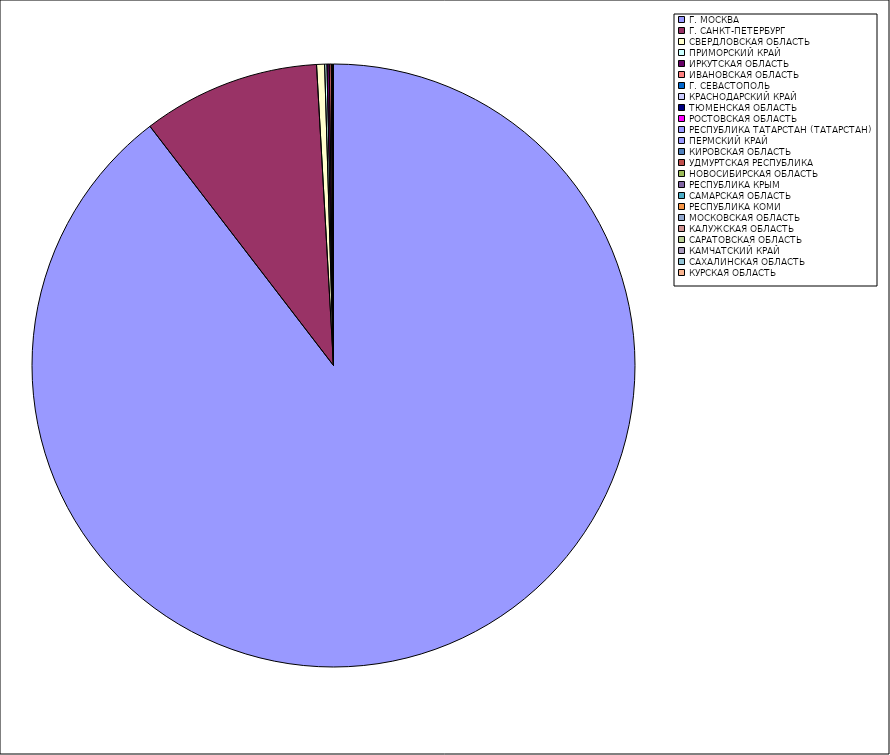
| Category | Оборот |
|---|---|
| Г. МОСКВА | 89.571 |
| Г. САНКТ-ПЕТЕРБУРГ | 9.519 |
| СВЕРДЛОВСКАЯ ОБЛАСТЬ | 0.428 |
| ПРИМОРСКИЙ КРАЙ | 0.123 |
| ИРКУТСКАЯ ОБЛАСТЬ | 0.122 |
| ИВАНОВСКАЯ ОБЛАСТЬ | 0.104 |
| Г. СЕВАСТОПОЛЬ | 0.025 |
| КРАСНОДАРСКИЙ КРАЙ | 0.02 |
| ТЮМЕНСКАЯ ОБЛАСТЬ | 0.011 |
| РОСТОВСКАЯ ОБЛАСТЬ | 0.009 |
| РЕСПУБЛИКА ТАТАРСТАН (ТАТАРСТАН) | 0.008 |
| ПЕРМСКИЙ КРАЙ | 0.006 |
| КИРОВСКАЯ ОБЛАСТЬ | 0.005 |
| УДМУРТСКАЯ РЕСПУБЛИКА | 0.005 |
| НОВОСИБИРСКАЯ ОБЛАСТЬ | 0.004 |
| РЕСПУБЛИКА КРЫМ | 0.004 |
| САМАРСКАЯ ОБЛАСТЬ | 0.004 |
| РЕСПУБЛИКА КОМИ | 0.003 |
| МОСКОВСКАЯ ОБЛАСТЬ | 0.003 |
| КАЛУЖСКАЯ ОБЛАСТЬ | 0.003 |
| САРАТОВСКАЯ ОБЛАСТЬ | 0.003 |
| КАМЧАТСКИЙ КРАЙ | 0.003 |
| САХАЛИНСКАЯ ОБЛАСТЬ | 0.003 |
| КУРСКАЯ ОБЛАСТЬ | 0.002 |